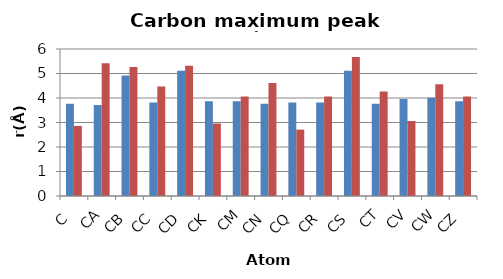
| Category | OW | HW |
|---|---|---|
| C | 3.762 | 2.86 |
| CA | 3.712 | 5.418 |
| CB | 4.916 | 5.268 |
| CC | 3.813 | 4.465 |
| CD | 5.117 | 5.318 |
| CK | 3.863 | 2.96 |
| CM | 3.863 | 4.064 |
| CN | 3.762 | 4.615 |
| CQ | 3.813 | 2.709 |
| CR | 3.813 | 4.064 |
| CS | 5.117 | 5.669 |
| CT | 3.762 | 4.264 |
| CV | 3.963 | 3.06 |
| CW | 4.013 | 4.565 |
| CZ | 3.863 | 4.064 |